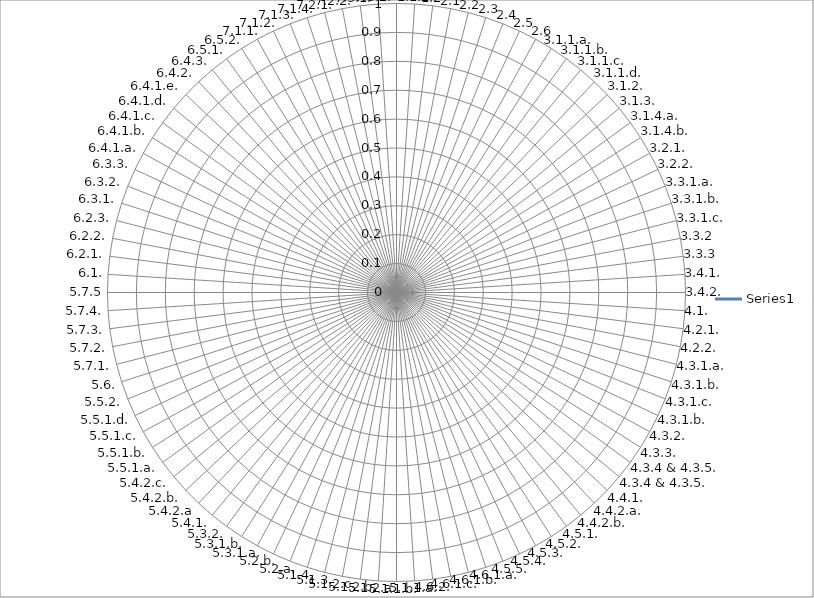
| Category | Series 0 |
|---|---|
| 1.1.1 | 0 |
| 1.1.2 | 0 |
| 1.2 | 0 |
| 2.1 | 0 |
| 2.2 | 0 |
| 2.3 | 0 |
| 2.4 | 0 |
| 2.5 | 0 |
| 2.6 | 0 |
| 3.1.1.a. | 0 |
| 3.1.1.b. | 0 |
| 3.1.1.c. | 0 |
| 3.1.1.d. | 0 |
| 3.1.2. | 0 |
| 3.1.3. | 0 |
| 3.1.4.a. | 0 |
| 3.1.4.b. | 0 |
| 3.2.1. | 0 |
| 3.2.2. | 0 |
| 3.3.1.a. | 0 |
| 3.3.1.b. | 0 |
| 3.3.1.c. | 0 |
| 3.3.2 | 0 |
| 3.3.3 | 0 |
| 3.4.1. | 0 |
| 3.4.2. | 0 |
| 4.1. | 0 |
| 4.2.1. | 0 |
| 4.2.2. | 0 |
| 4.3.1.a. | 0 |
| 4.3.1.b. | 0 |
| 4.3.1.c. | 0 |
| 4.3.1.b. | 0 |
| 4.3.2. | 0 |
| 4.3.3. | 0 |
| 4.3.4 & 4.3.5. | 0 |
| 4.3.4 & 4.3.5. | 0 |
| 4.4.1. | 0 |
| 4.4.2.a. | 0 |
| 4.4.2.b. | 0 |
| 4.5.1. | 0 |
| 4.5.2. | 0 |
| 4.5.3. | 0 |
| 4.5.4. | 0 |
| 4.5.5. | 0 |
| 4.6.1.a. | 0 |
| 4.6.1.b. | 0 |
| 4.6.1.c. | 0 |
| 4.6.2. | 0 |
| 5.1.1.a. | 0 |
| 5.1.1.b. | 0 |
| 5.1.2.a. | 0 |
| 5.1.2.b. | 0 |
| 5.1.2.c. | 0 |
| 5.1.3. | 0 |
| 5.1.4. | 0 |
| 5.2.a. | 0 |
| 5.2.b. | 0 |
| 5.3.1.a. | 0 |
| 5.3.1.b. | 0 |
| 5.3.2. | 0 |
| 5.4.1. | 0 |
| 5.4.2.a | 0 |
| 5.4.2.b. | 0 |
| 5.4.2.c. | 0 |
| 5.5.1.a. | 0 |
| 5.5.1.b. | 0 |
| 5.5.1.c. | 0 |
| 5.5.1.d. | 0 |
| 5.5.2. | 0 |
| 5.6. | 0 |
| 5.7.1. | 0 |
| 5.7.2. | 0 |
| 5.7.3. | 0 |
| 5.7.4. | 0 |
| 5.7.5 | 0 |
| 6.1. | 0 |
| 6.2.1. | 0 |
| 6.2.2. | 0 |
| 6.2.3. | 0 |
| 6.3.1. | 0 |
| 6.3.2. | 0 |
| 6.3.3. | 0 |
| 6.4.1.a. | 0 |
| 6.4.1.b. | 0 |
| 6.4.1.c. | 0 |
| 6.4.1.d. | 0 |
| 6.4.1.e. | 0 |
| 6.4.2. | 0 |
| 6.4.3. | 0 |
| 6.5.1. | 0 |
| 6.5.2. | 0 |
| 7.1.1. | 0 |
| 7.1.2. | 0 |
| 7.1.3. | 0 |
| 7.1.4. | 0 |
| 7.2.1. | 0 |
| 7.2.2. | 0 |
| 7.3.1. | 0 |
| 7.3.2. | 0 |